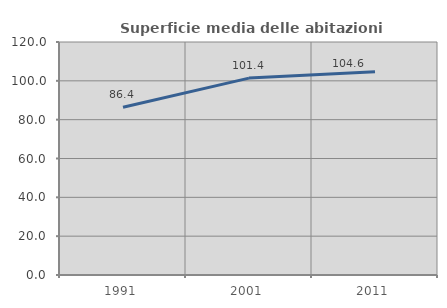
| Category | Superficie media delle abitazioni occupate |
|---|---|
| 1991.0 | 86.4 |
| 2001.0 | 101.414 |
| 2011.0 | 104.636 |